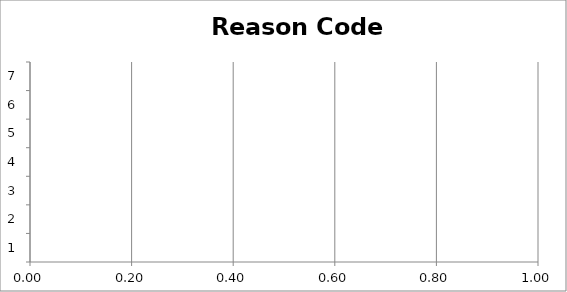
| Category | Frequency |
|---|---|
| 0 | 0 |
| 1 | 0 |
| 2 | 0 |
| 3 | 0 |
| 4 | 0 |
| 5 | 0 |
| 6 | 0 |